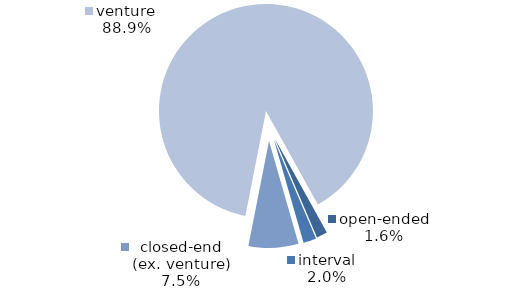
| Category | Series 0 |
|---|---|
| open-ended | 19 |
| interval | 23 |
| closed-end (ex. venture) | 88 |
| venture | 1036 |